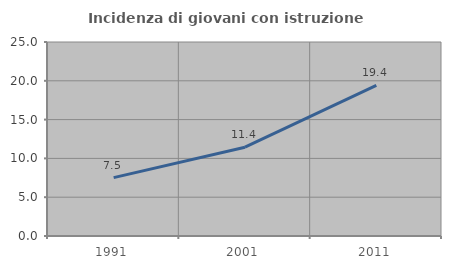
| Category | Incidenza di giovani con istruzione universitaria |
|---|---|
| 1991.0 | 7.519 |
| 2001.0 | 11.443 |
| 2011.0 | 19.403 |